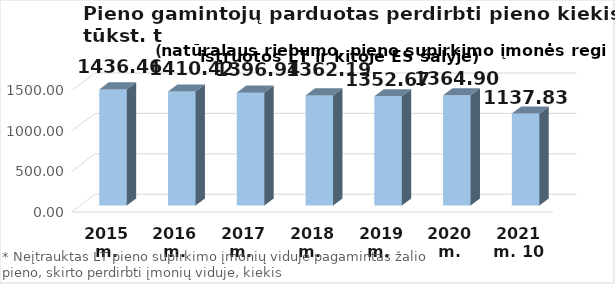
| Category | Iš viso |
|---|---|
| 2015 m. | 1436.455 |
| 2016 m. | 1410.42 |
| 2017 m.  | 1396.944 |
| 2018 m.  | 1362.189 |
| 2019 m.  | 1352.67 |
| 2020 m. | 1364.9 |
| 2021 m. 10 mėn. | 1137.829 |